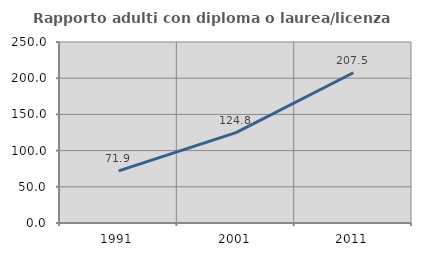
| Category | Rapporto adulti con diploma o laurea/licenza media  |
|---|---|
| 1991.0 | 71.921 |
| 2001.0 | 124.766 |
| 2011.0 | 207.5 |